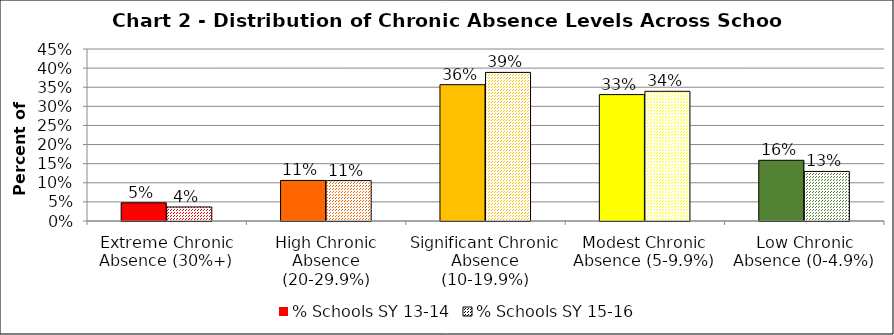
| Category | % Schools SY 13-14 | % Schools SY 15-16 |
|---|---|---|
| Extreme Chronic Absence (30%+) | 0.048 | 0.037 |
| High Chronic Absence (20-29.9%) | 0.106 | 0.106 |
| Significant Chronic Absence (10-19.9%) | 0.357 | 0.389 |
| Modest Chronic Absence (5-9.9%) | 0.331 | 0.339 |
| Low Chronic Absence (0-4.9%) | 0.159 | 0.13 |